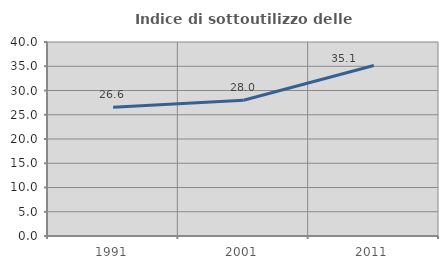
| Category | Indice di sottoutilizzo delle abitazioni  |
|---|---|
| 1991.0 | 26.569 |
| 2001.0 | 28 |
| 2011.0 | 35.149 |